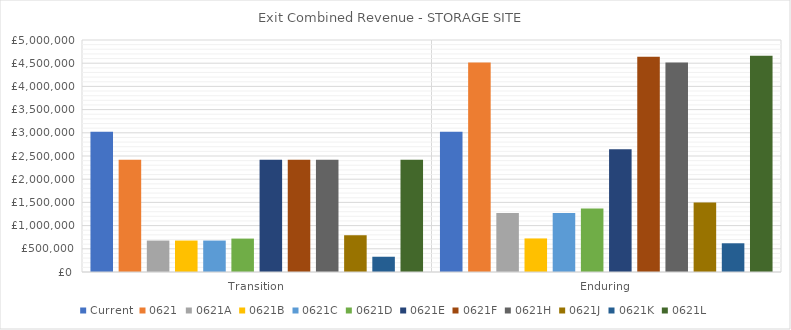
| Category | Current | 0621 | 0621A | 0621B | 0621C | 0621D | 0621E | 0621F | 0621H | 0621J | 0621K | 0621L |
|---|---|---|---|---|---|---|---|---|---|---|---|---|
| Transition | 3022394.825 | 2419914.759 | 677576.133 | 677576.133 | 677576.133 | 720132.14 | 2419914.759 | 2419914.759 | 2419914.759 | 792341.539 | 328894.718 | 2419914.759 |
| Enduring | 3022394.825 | 4512902.707 | 1273371.159 | 723309.351 | 1273371.159 | 1367145.822 | 2648025.556 | 4637875.656 | 4512902.707 | 1500197.561 | 619049.7 | 4657983.924 |